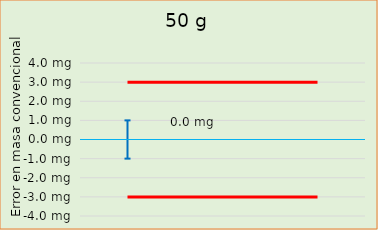
| Category | Error en masa convencional  |  ± EMP |
|---|---|---|
| 0 |  | -3 |
| 1 |  | -3 |
| 2 |  | -3 |